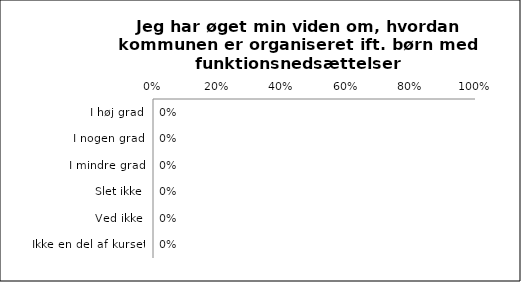
| Category | Øget viden om hvordan kommunen er organiseret ift. Børn me funktionsnedsættelse |
|---|---|
| I høj grad | 0 |
| I nogen grad | 0 |
| I mindre grad | 0 |
| Slet ikke | 0 |
| Ved ikke | 0 |
| Ikke en del af kurset | 0 |